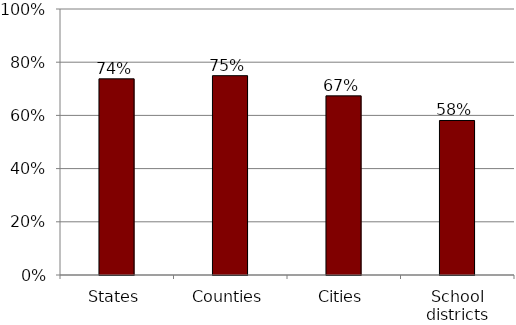
| Category | Series 1 |
|---|---|
| States | 0.737 |
| Counties | 0.749 |
| Cities | 0.673 |
| School districts | 0.581 |